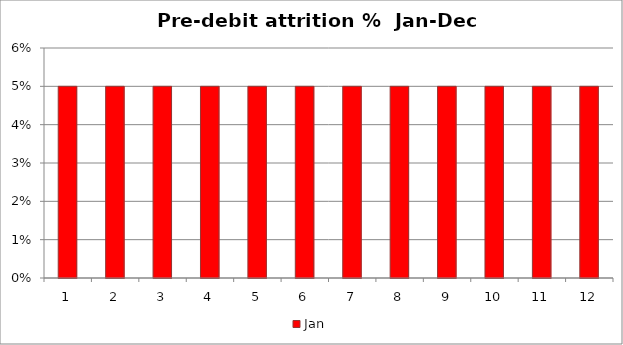
| Category | Jan |
|---|---|
| 0 | 0.05 |
| 1 | 0.05 |
| 2 | 0.05 |
| 3 | 0.05 |
| 4 | 0.05 |
| 5 | 0.05 |
| 6 | 0.05 |
| 7 | 0.05 |
| 8 | 0.05 |
| 9 | 0.05 |
| 10 | 0.05 |
| 11 | 0.05 |